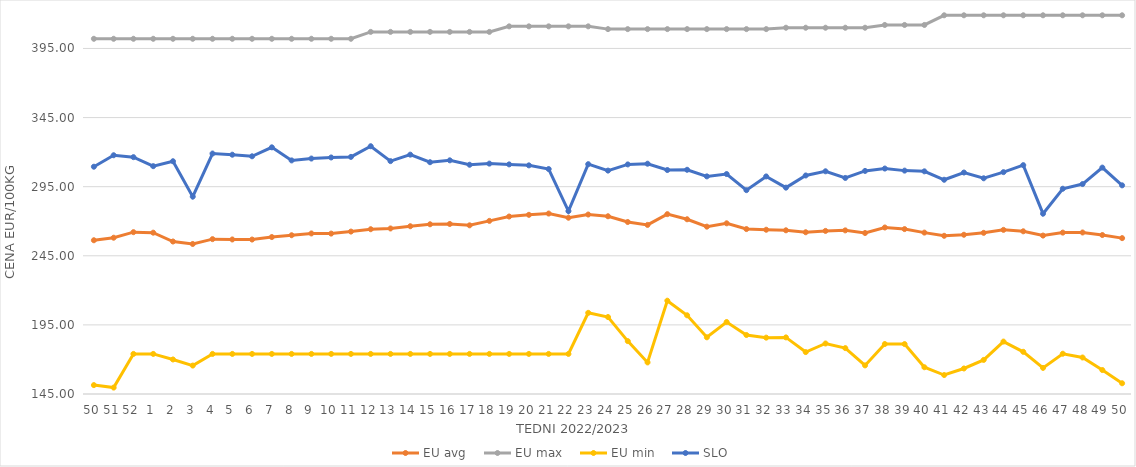
| Category | EU avg | EU max | EU min | SLO |
|---|---|---|---|---|
| 50.0 | 256.24 | 402 | 151.434 | 309.44 |
| 51.0 | 258.071 | 402 | 149.638 | 317.74 |
| 52.0 | 262.088 | 402 | 174 | 316.36 |
| 1.0 | 261.716 | 402 | 174 | 309.84 |
| 2.0 | 255.331 | 402 | 169.983 | 313.4 |
| 3.0 | 253.546 | 402 | 165.574 | 287.81 |
| 4.0 | 257.051 | 402 | 174 | 318.98 |
| 5.0 | 256.808 | 402 | 174 | 318.13 |
| 6.0 | 256.75 | 402 | 174 | 316.99 |
| 7.0 | 258.565 | 402 | 174 | 323.47 |
| 8.0 | 259.872 | 402 | 174 | 314 |
| 9.0 | 261.164 | 402 | 174 | 315.35 |
| 10.0 | 261.06 | 402 | 174 | 316.13 |
| 11.0 | 262.513 | 402 | 174 | 316.55 |
| 12.0 | 264.228 | 407 | 174 | 324.27 |
| 13.0 | 264.768 | 407 | 174 | 313.49 |
| 14.0 | 266.385 | 407 | 174 | 318.17 |
| 15.0 | 267.797 | 407 | 174 | 312.7 |
| 16.0 | 268.021 | 407 | 174 | 314.07 |
| 17.0 | 267.041 | 407 | 174 | 310.87 |
| 18.0 | 270.255 | 407 | 174 | 311.69 |
| 19.0 | 273.406 | 411 | 174 | 311.13 |
| 20.0 | 274.631 | 411 | 174 | 310.42 |
| 21.0 | 275.561 | 411 | 174 | 307.76 |
| 22.0 | 272.542 | 411 | 174 | 277.34 |
| 23.0 | 274.85 | 411 | 203.728 | 311.28 |
| 24.0 | 273.59 | 409 | 200.686 | 306.64 |
| 25.0 | 269.439 | 409 | 183.275 | 311.1 |
| 26.0 | 267.345 | 409 | 167.858 | 311.62 |
| 27.0 | 275.123 | 409 | 212.506 | 307.04 |
| 28.0 | 271.42 | 409 | 201.945 | 307.23 |
| 29.0 | 266.08 | 409 | 186.018 | 302.45 |
| 30.0 | 268.49 | 409 | 197.093 | 304.14 |
| 31.0 | 264.334 | 409 | 187.684 | 292.49 |
| 32.0 | 263.844 | 409 | 185.774 | 302.41 |
| 33.0 | 263.441 | 410 | 185.951 | 294.3 |
| 34.0 | 262.028 | 410 | 175.332 | 303.1 |
| 35.0 | 262.997 | 410 | 181.543 | 306.13 |
| 36.0 | 263.389 | 410 | 178.207 | 301.32 |
| 37.0 | 261.486 | 410 | 165.697 | 306.4 |
| 38.0 | 265.47 | 412 | 181.159 | 308.12 |
| 39.0 | 264.316 | 412 | 181.124 | 306.62 |
| 40.0 | 261.774 | 412 | 164.37 | 306.1 |
| 41.0 | 259.456 | 419 | 158.728 | 300 |
| 42.0 | 260.21 | 419 | 163.464 | 305.24 |
| 43.0 | 261.605 | 419 | 169.66 | 301.07 |
| 44.0 | 263.758 | 419 | 182.925 | 305.52 |
| 45.0 | 262.714 | 419 | 175.524 | 310.58 |
| 46.0 | 259.625 | 419 | 163.882 | 275.46 |
| 47.0 | 261.772 | 419 | 174.136 | 293.51 |
| 48.0 | 261.864 | 419 | 171.4 | 296.9 |
| 49.0 | 260.014 | 419 | 162.336 | 308.8 |
| 50.0 | 257.774 | 419 | 152.762 | 295.97 |